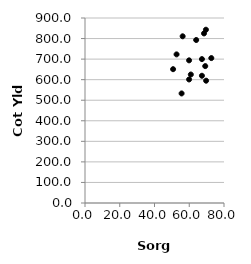
| Category | Series 0 |
|---|---|
| 59.9 | 601 |
| 72.7 | 705 |
| 55.6 | 533 |
| 67.3 | 700 |
| 69.2 | 666 |
| 67.3 | 619 |
| 69.7 | 595 |
| 60.9 | 625 |
| 59.9 | 694 |
| 50.7 | 651 |
| 52.7 | 723 |
| 69.6 | 843 |
| 68.5 | 825 |
| 56.2 | 811 |
| 64.0 | 793 |